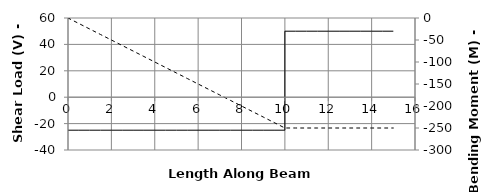
| Category | V |
|---|---|
| 0.0 | -25 |
| 0.0 | -25 |
| 0.5 | -25 |
| 1.0 | -25 |
| 1.5 | -25 |
| 2.0 | -25 |
| 2.5 | -25 |
| 3.0 | -25 |
| 3.5 | -25 |
| 4.0 | -25 |
| 4.5 | -25 |
| 5.0 | -25 |
| 5.5 | -25 |
| 6.0 | -25 |
| 6.5 | -25 |
| 7.0 | -25 |
| 7.5 | -25 |
| 8.0 | -25 |
| 8.5 | -25 |
| 9.0 | -25 |
| 9.5 | -25 |
| 9.99999 | -25 |
| 10.0 | 50 |
| 10.5 | 50 |
| 11.0 | 50 |
| 11.5 | 50 |
| 12.0 | 50 |
| 12.5 | 50 |
| 13.0 | 50 |
| 13.5 | 50 |
| 14.0 | 50 |
| 14.5 | 50 |
| 15.0 | 50 |
| 15.0 | 50 |